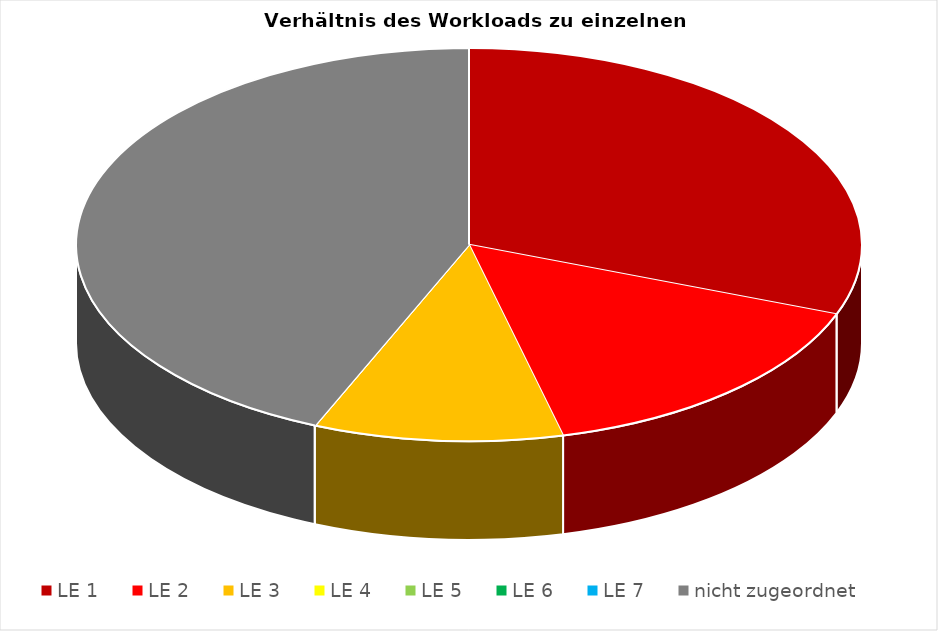
| Category | Series 0 |
|---|---|
| LE 1 | 12 |
| LE 2 | 6 |
| LE 3 | 4 |
| LE 4 | 0 |
| LE 5 | 0 |
| LE 6 | 0 |
| LE 7 | 0 |
| nicht zugeordnet | 17 |